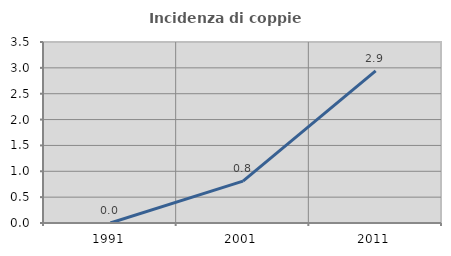
| Category | Incidenza di coppie miste |
|---|---|
| 1991.0 | 0 |
| 2001.0 | 0.811 |
| 2011.0 | 2.941 |